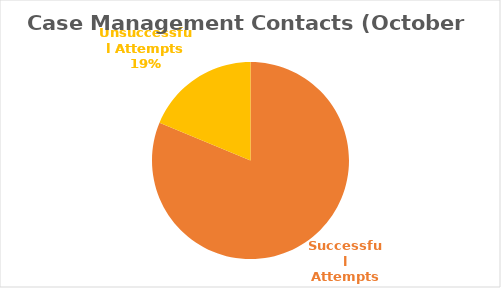
| Category | Series 0 |
|---|---|
| Successful Attempts | 208 |
| Unsuccessful Attempts | 48 |